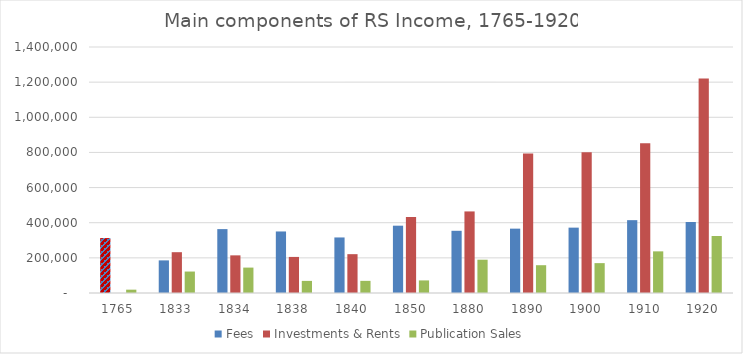
| Category | Fees | Investments & Rents | Publication Sales |
|---|---|---|---|
| 1765.0 | 312401 | 0 | 18960 |
| 1833.0 | 185610 | 232238 | 122130 |
| 1834.0 | 363582 | 214238 | 144612 |
| 1838.0 | 350208 | 205301 | 68910 |
| 1840.0 | 316128 | 221029 | 69108 |
| 1850.0 | 383088 | 432631 | 71631 |
| 1880.0 | 354000 | 464251 | 189498 |
| 1890.0 | 366240 | 794435 | 158202 |
| 1900.0 | 372000 | 801548 | 169992 |
| 1910.0 | 414539 | 851756 | 236976 |
| 1920.0 | 404054 | 1221299 | 324264 |